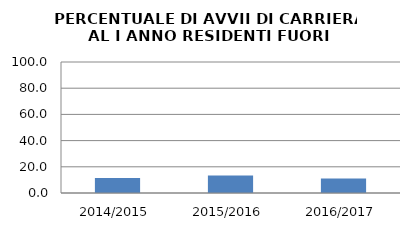
| Category | 2014/2015 2015/2016 2016/2017 |
|---|---|
| 2014/2015 | 11.494 |
| 2015/2016 | 13.333 |
| 2016/2017 | 10.976 |